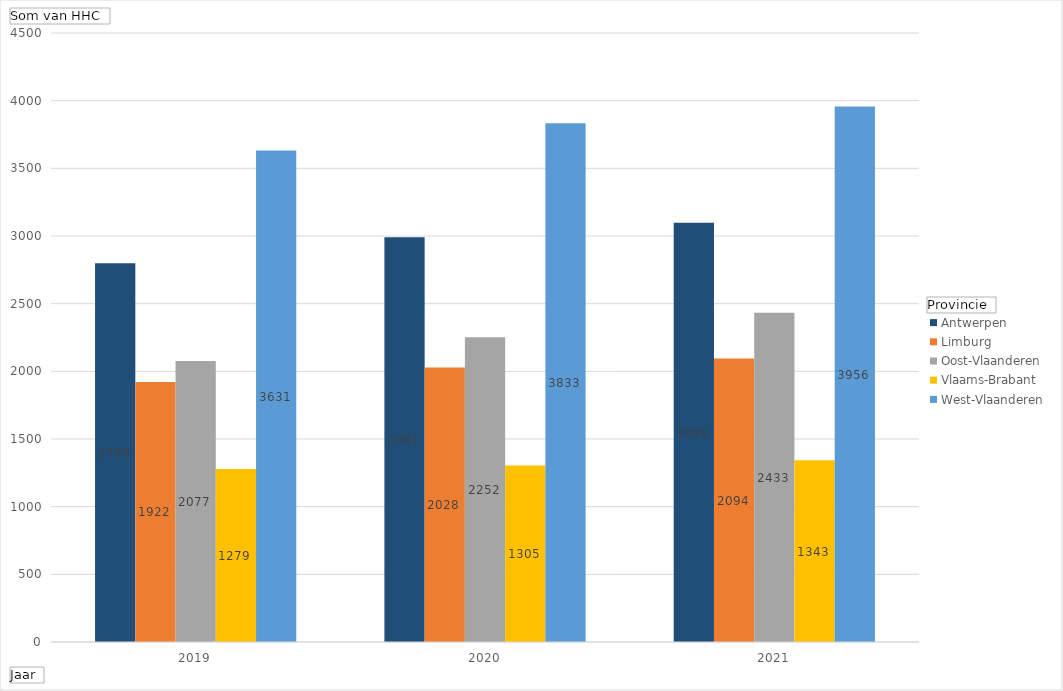
| Category | Antwerpen | Limburg | Oost-Vlaanderen | Vlaams-Brabant | West-Vlaanderen |
|---|---|---|---|---|---|
| 2019 | 2798 | 1922 | 2077 | 1279 | 3631 |
| 2020 | 2991 | 2028 | 2252 | 1305 | 3833 |
| 2021 | 3098 | 2094 | 2433 | 1343 | 3956 |